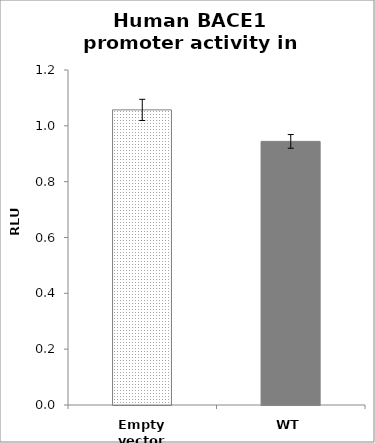
| Category | Series 0 |
|---|---|
| Empty vector | 1.057 |
| WT | 0.944 |